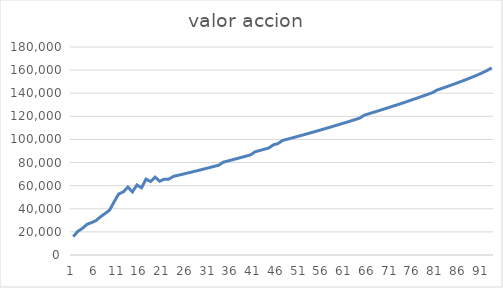
| Category | valor accion  |
|---|---|
| 0 | 15936.971 |
| 1 | 20496.493 |
| 2 | 22988.372 |
| 3 | 26512.744 |
| 4 | 28021.599 |
| 5 | 29785.845 |
| 6 | 33098.262 |
| 7 | 35919.953 |
| 8 | 38934.396 |
| 9 | 46198.167 |
| 10 | 52857.037 |
| 11 | 54625.696 |
| 12 | 58755.366 |
| 13 | 54611.295 |
| 14 | 60608.799 |
| 15 | 58180.899 |
| 16 | 65674.768 |
| 17 | 63594.901 |
| 18 | 67405.891 |
| 19 | 63803.602 |
| 20 | 65628.822 |
| 21 | 65621.009 |
| 22 | 68016.203 |
| 23 | 68931.781 |
| 24 | 69859.86 |
| 25 | 70800.618 |
| 26 | 71754.236 |
| 27 | 72720.9 |
| 28 | 73700.797 |
| 29 | 74694.118 |
| 30 | 75701.058 |
| 31 | 76721.813 |
| 32 | 77756.586 |
| 33 | 80340.843 |
| 34 | 81364.863 |
| 35 | 82402.218 |
| 36 | 83453.096 |
| 37 | 84517.687 |
| 38 | 85596.187 |
| 39 | 86688.793 |
| 40 | 89360.331 |
| 41 | 90434.278 |
| 42 | 91521.519 |
| 43 | 92622.236 |
| 44 | 95321.891 |
| 45 | 96396.637 |
| 46 | 99097.87 |
| 47 | 100140.094 |
| 48 | 101193.76 |
| 49 | 102259.022 |
| 50 | 103336.036 |
| 51 | 104424.962 |
| 52 | 105525.968 |
| 53 | 106639.222 |
| 54 | 107764.902 |
| 55 | 108903.188 |
| 56 | 110054.268 |
| 57 | 111218.337 |
| 58 | 112395.598 |
| 59 | 113586.259 |
| 60 | 114790.54 |
| 61 | 116008.669 |
| 62 | 117240.887 |
| 63 | 118487.444 |
| 64 | 121057.318 |
| 65 | 122252.516 |
| 66 | 123460.998 |
| 67 | 124683.038 |
| 68 | 125918.929 |
| 69 | 127168.988 |
| 70 | 128433.559 |
| 71 | 129713.017 |
| 72 | 131007.772 |
| 73 | 132318.279 |
| 74 | 133645.045 |
| 75 | 134988.638 |
| 76 | 136349.706 |
| 77 | 137728.986 |
| 78 | 139127.337 |
| 79 | 140545.767 |
| 80 | 142770.344 |
| 81 | 144123.348 |
| 82 | 145497.91 |
| 83 | 146896.067 |
| 84 | 148320.455 |
| 85 | 149774.586 |
| 86 | 151263.301 |
| 87 | 152793.58 |
| 88 | 154376.054 |
| 89 | 156028.185 |
| 90 | 157781.841 |
| 91 | 159705.508 |
| 92 | 161996.292 |